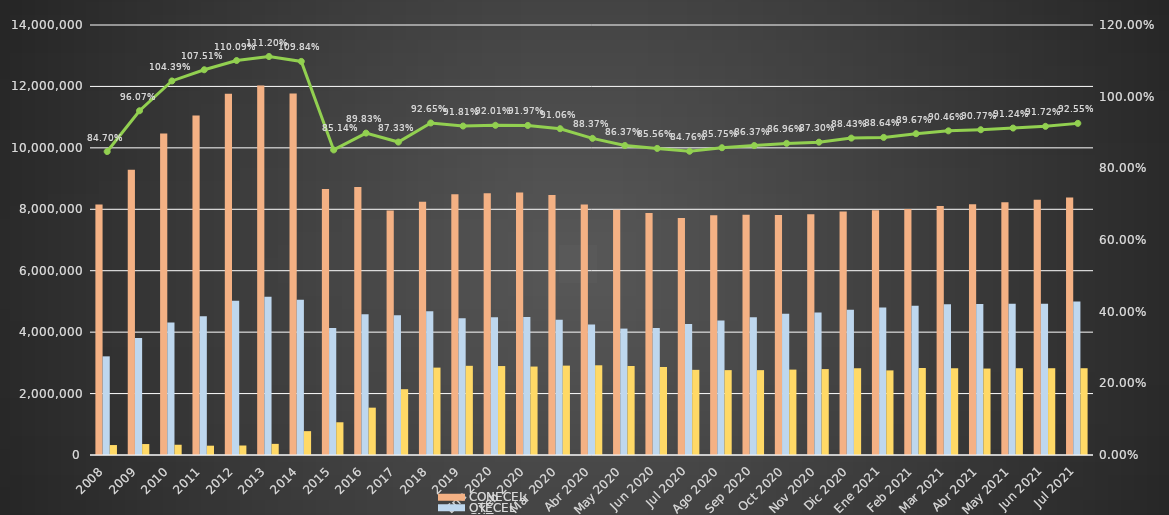
| Category | CONECEL | OTECEL | CNT |
|---|---|---|---|
| 2008 | 8156359 | 3211922 | 323967 |
| 2009 | 9291268 | 3806432 | 356900 |
| 2010 | 10470502 | 4314599 | 333730 |
| 2011 | 11057316 | 4513874 | 303368 |
| 2012 | 11757906 | 5019686 | 309271 |
| 2013 | 12030886 | 5148308 | 362560 |
| 2014 | 11772020 | 5055645 | 776892 |
| 2015 | 8658619 | 4134698 | 1065703 |
| 2016 | 8726823 | 4580092 | 1541219 |
| 2017 | 7960263 | 4549024 | 2142117 |
| 2018 | 8248050 | 4679646 | 2845142 |
| 2019 | 8493054 | 4456356 | 2903690 |
| Ene 2020 | 8524942 | 4485778 | 2896237 |
| Feb 2020 | 8547436 | 4491497 | 2879525 |
| Mar 2020 | 8465092 | 4404214 | 2909915 |
| Abr 2020 | 8157884 | 4251952 | 2921050 |
| May 2020 | 7987799 | 4115703 | 2898420 |
| Jun 2020 | 7877571 | 4134378 | 2865827 |
| Jul 2020 | 7718071 | 4266563 | 2772437 |
| Ago 2020 | 7806588 | 4375909 | 2763303 |
| Sep 2020 | 7821877 | 4486010 | 2762939 |
| Oct 2020 | 7810241 | 4601855 | 2780545 |
| Nov 2020 | 7836096 | 4636163 | 2797069 |
| Dic 2020 | 7929253 | 4729725 | 2826388 |
| Ene 2021 | 7965274 | 4800608 | 2755177 |
| Feb 2021 | 8012894 | 4856877 | 2831764 |
| Mar 2021 | 8103873 | 4909433 | 2827246 |
| Abr 2021 | 8163884 | 4915830 | 2814894 |
| May 2021 | 8227613 | 4923245 | 2825401 |
| Jun 2021 | 8307915 | 4927307 | 2825401 |
| Jul 2021 | 8383604 | 4996675 | 2825401 |